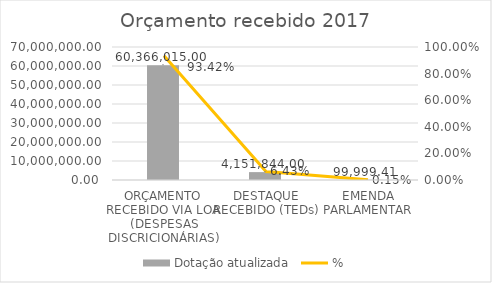
| Category | Dotação atualizada |
|---|---|
| ORÇAMENTO RECEBIDO VIA LOA (DESPESAS DISCRICIONÁRIAS) | 60366015 |
| DESTAQUE RECEBIDO (TEDs) | 4151844 |
| EMENDA PARLAMENTAR | 99999.41 |